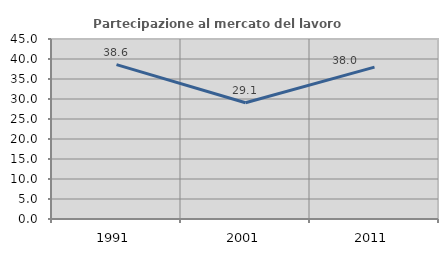
| Category | Partecipazione al mercato del lavoro  femminile |
|---|---|
| 1991.0 | 38.599 |
| 2001.0 | 29.076 |
| 2011.0 | 37.98 |